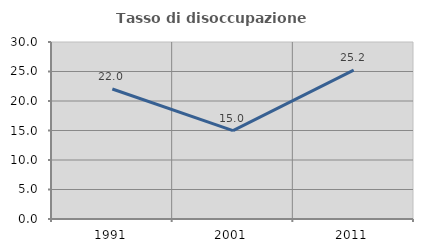
| Category | Tasso di disoccupazione giovanile  |
|---|---|
| 1991.0 | 22.039 |
| 2001.0 | 14.987 |
| 2011.0 | 25.227 |